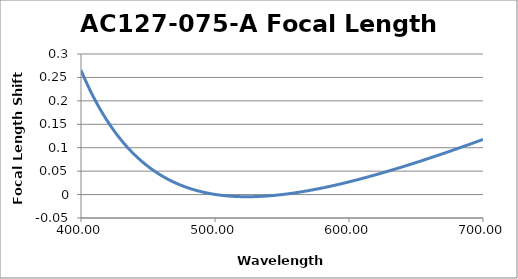
| Category | Focal Length Shift (mm) |
|---|---|
| 400.0 | 0.265 |
| 402.5 | 0.249 |
| 405.0 | 0.233 |
| 407.5 | 0.218 |
| 410.0 | 0.204 |
| 412.5 | 0.191 |
| 415.0 | 0.179 |
| 417.5 | 0.167 |
| 420.0 | 0.156 |
| 422.5 | 0.145 |
| 425.0 | 0.135 |
| 427.5 | 0.125 |
| 430.0 | 0.116 |
| 432.5 | 0.108 |
| 435.0 | 0.1 |
| 437.5 | 0.092 |
| 440.0 | 0.085 |
| 442.5 | 0.078 |
| 445.0 | 0.072 |
| 447.5 | 0.066 |
| 450.0 | 0.06 |
| 452.5 | 0.055 |
| 455.0 | 0.05 |
| 457.5 | 0.045 |
| 460.0 | 0.041 |
| 462.5 | 0.036 |
| 465.0 | 0.033 |
| 467.5 | 0.029 |
| 470.0 | 0.026 |
| 472.5 | 0.022 |
| 475.0 | 0.019 |
| 477.5 | 0.017 |
| 480.0 | 0.014 |
| 482.5 | 0.012 |
| 485.0 | 0.01 |
| 487.5 | 0.008 |
| 490.0 | 0.006 |
| 492.5 | 0.004 |
| 495.0 | 0.003 |
| 497.5 | 0.002 |
| 500.0 | 0 |
| 502.49999999999994 | -0.001 |
| 505.0 | -0.002 |
| 507.49999999999994 | -0.002 |
| 510.0 | -0.003 |
| 512.5 | -0.004 |
| 515.0 | -0.004 |
| 517.5 | -0.004 |
| 520.0 | -0.004 |
| 522.5 | -0.005 |
| 525.0 | -0.005 |
| 527.5 | -0.005 |
| 530.0 | -0.004 |
| 532.5 | -0.004 |
| 535.0 | -0.004 |
| 537.5 | -0.003 |
| 540.0 | -0.003 |
| 542.5 | -0.002 |
| 545.0 | -0.002 |
| 547.5 | -0.001 |
| 550.0 | 0 |
| 552.5 | 0.001 |
| 555.0 | 0.002 |
| 557.5 | 0.003 |
| 560.0 | 0.004 |
| 562.5 | 0.005 |
| 565.0 | 0.006 |
| 567.5 | 0.007 |
| 570.0 | 0.009 |
| 572.5 | 0.01 |
| 575.0 | 0.011 |
| 577.5 | 0.013 |
| 580.0 | 0.014 |
| 582.5 | 0.016 |
| 585.0 | 0.017 |
| 587.5 | 0.019 |
| 590.0 | 0.02 |
| 592.5 | 0.022 |
| 595.0 | 0.024 |
| 597.5 | 0.025 |
| 600.0 | 0.027 |
| 602.5 | 0.029 |
| 605.0 | 0.031 |
| 607.5 | 0.033 |
| 610.0 | 0.034 |
| 612.5 | 0.036 |
| 615.0 | 0.038 |
| 617.5 | 0.04 |
| 620.0 | 0.042 |
| 622.5 | 0.044 |
| 625.0 | 0.046 |
| 627.5 | 0.049 |
| 630.0 | 0.051 |
| 632.5 | 0.053 |
| 635.0 | 0.055 |
| 637.5 | 0.057 |
| 640.0 | 0.059 |
| 642.5 | 0.062 |
| 645.0 | 0.064 |
| 647.5 | 0.066 |
| 650.0 | 0.068 |
| 652.5 | 0.071 |
| 655.0 | 0.073 |
| 657.5 | 0.075 |
| 660.0 | 0.078 |
| 662.5 | 0.08 |
| 665.0 | 0.082 |
| 667.5 | 0.085 |
| 670.0 | 0.087 |
| 672.5 | 0.09 |
| 675.0 | 0.092 |
| 677.5 | 0.095 |
| 680.0 | 0.097 |
| 682.5 | 0.1 |
| 685.0 | 0.102 |
| 687.5 | 0.105 |
| 690.0 | 0.107 |
| 692.5 | 0.11 |
| 695.0 | 0.112 |
| 697.5 | 0.115 |
| 700.0 | 0.118 |